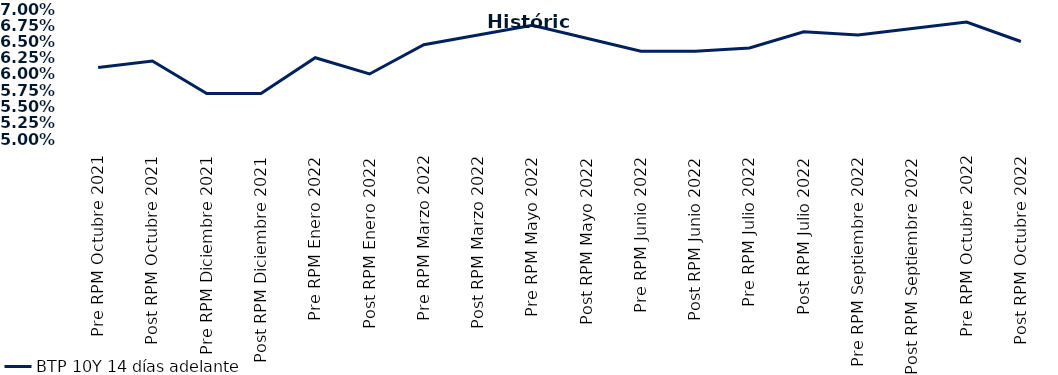
| Category | BTP 10Y 14 días adelante |
|---|---|
| Pre RPM Octubre 2021 | 0.061 |
| Post RPM Octubre 2021 | 0.062 |
| Pre RPM Diciembre 2021 | 0.057 |
| Post RPM Diciembre 2021 | 0.057 |
| Pre RPM Enero 2022 | 0.062 |
| Post RPM Enero 2022 | 0.06 |
| Pre RPM Marzo 2022 | 0.064 |
| Post RPM Marzo 2022 | 0.066 |
| Pre RPM Mayo 2022 | 0.068 |
| Post RPM Mayo 2022 | 0.066 |
| Pre RPM Junio 2022 | 0.064 |
| Post RPM Junio 2022 | 0.064 |
| Pre RPM Julio 2022 | 0.064 |
| Post RPM Julio 2022 | 0.066 |
| Pre RPM Septiembre 2022 | 0.066 |
| Post RPM Septiembre 2022 | 0.067 |
| Pre RPM Octubre 2022 | 0.068 |
| Post RPM Octubre 2022 | 0.065 |